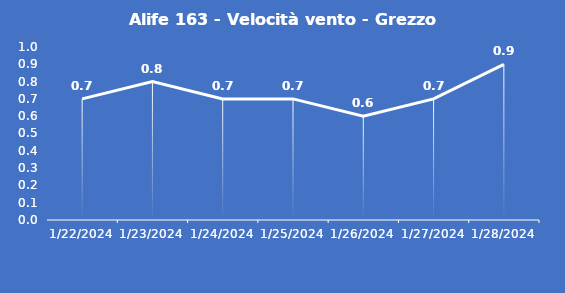
| Category | Alife 163 - Velocità vento - Grezzo (m/s) |
|---|---|
| 1/22/24 | 0.7 |
| 1/23/24 | 0.8 |
| 1/24/24 | 0.7 |
| 1/25/24 | 0.7 |
| 1/26/24 | 0.6 |
| 1/27/24 | 0.7 |
| 1/28/24 | 0.9 |